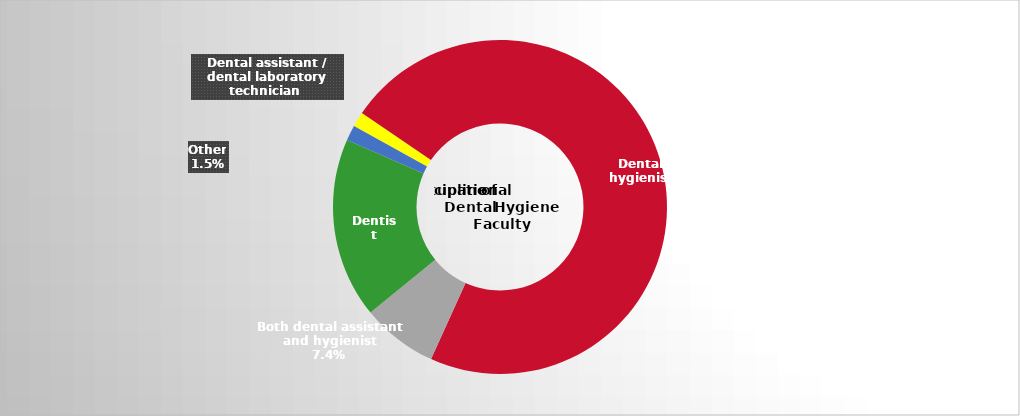
| Category | Series 2 |
|---|---|
| Dental assistant / dental laboratory technician  | 0.014 |
| Dental hygienist | 0.723 |
| Both dental assistant and hygienist | 0.074 |
| Dentist | 0.174 |
| Other | 0.015 |